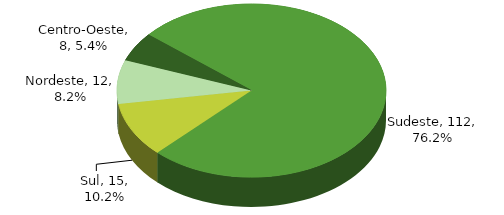
| Category | Quantidade Obras |
|---|---|
| Sudeste | 112 |
| Sul | 15 |
| Nordeste | 12 |
| Centro-Oeste | 8 |